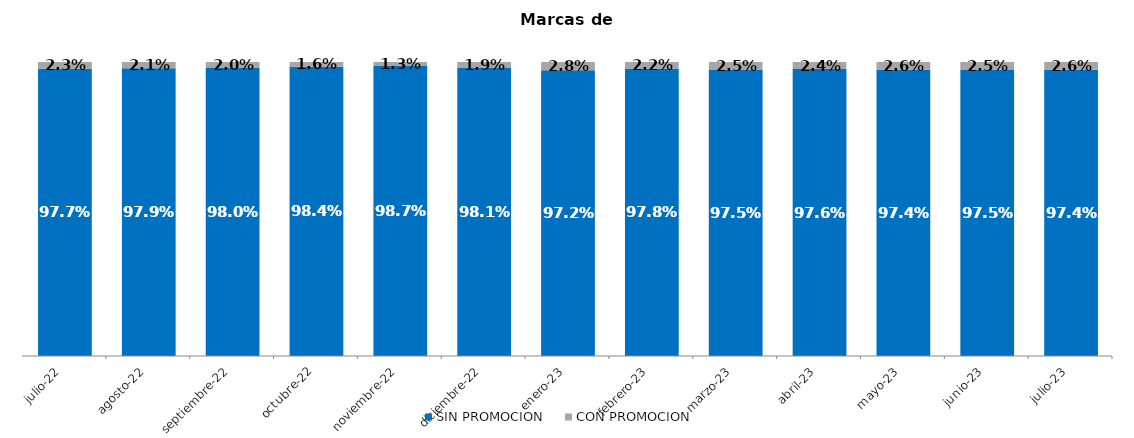
| Category | SIN PROMOCION   | CON PROMOCION   |
|---|---|---|
| 2022-07-01 | 0.977 | 0.023 |
| 2022-08-01 | 0.979 | 0.021 |
| 2022-09-01 | 0.98 | 0.02 |
| 2022-10-01 | 0.984 | 0.016 |
| 2022-11-01 | 0.987 | 0.013 |
| 2022-12-01 | 0.981 | 0.019 |
| 2023-01-01 | 0.972 | 0.028 |
| 2023-02-01 | 0.978 | 0.022 |
| 2023-03-01 | 0.975 | 0.025 |
| 2023-04-01 | 0.976 | 0.024 |
| 2023-05-01 | 0.974 | 0.026 |
| 2023-06-01 | 0.975 | 0.025 |
| 2023-07-01 | 0.974 | 0.026 |